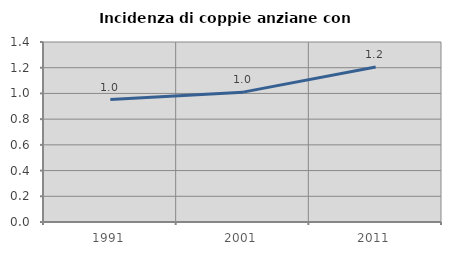
| Category | Incidenza di coppie anziane con figli |
|---|---|
| 1991.0 | 0.952 |
| 2001.0 | 1.01 |
| 2011.0 | 1.205 |